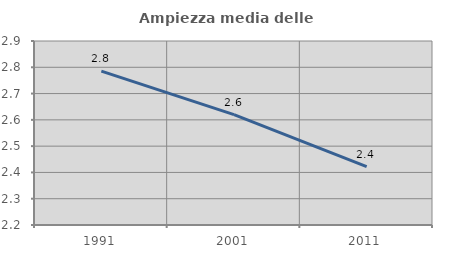
| Category | Ampiezza media delle famiglie |
|---|---|
| 1991.0 | 2.786 |
| 2001.0 | 2.62 |
| 2011.0 | 2.422 |